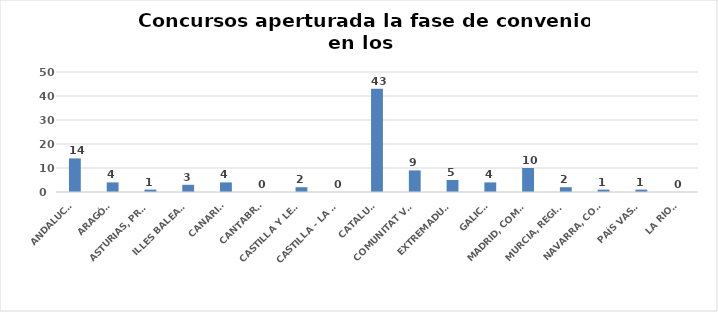
| Category | Series 0 |
|---|---|
| ANDALUCÍA | 14 |
| ARAGÓN | 4 |
| ASTURIAS, PRINCIPADO | 1 |
| ILLES BALEARS | 3 |
| CANARIAS | 4 |
| CANTABRIA | 0 |
| CASTILLA Y LEÓN | 2 |
| CASTILLA - LA MANCHA | 0 |
| CATALUÑA | 43 |
| COMUNITAT VALENCIANA | 9 |
| EXTREMADURA | 5 |
| GALICIA | 4 |
| MADRID, COMUNIDAD | 10 |
| MURCIA, REGIÓN | 2 |
| NAVARRA, COM. FORAL | 1 |
| PAÍS VASCO | 1 |
| LA RIOJA | 0 |